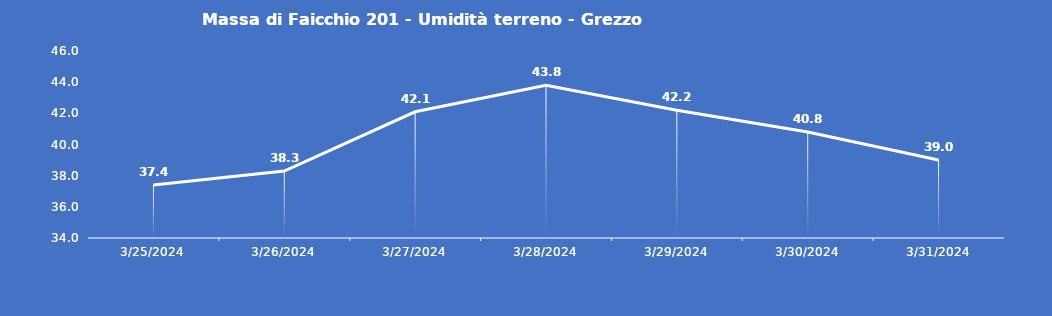
| Category | Massa di Faicchio 201 - Umidità terreno - Grezzo (%VWC) |
|---|---|
| 3/25/24 | 37.4 |
| 3/26/24 | 38.3 |
| 3/27/24 | 42.1 |
| 3/28/24 | 43.8 |
| 3/29/24 | 42.2 |
| 3/30/24 | 40.8 |
| 3/31/24 | 39 |